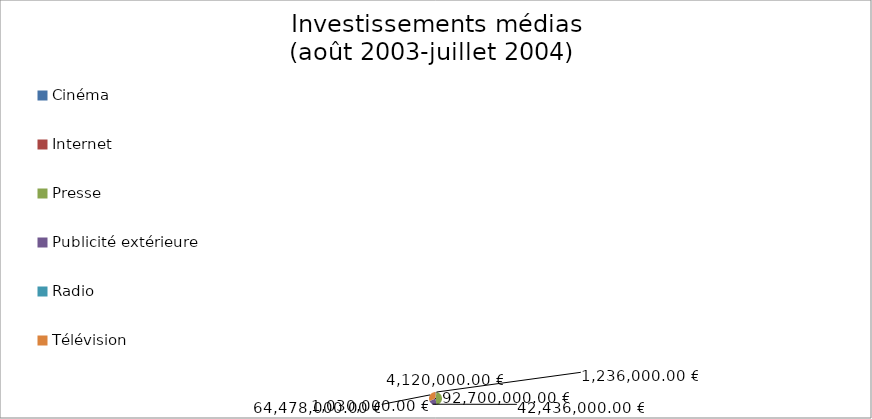
| Category | Series 0 |
|---|---|
| Cinéma | 4120000 |
| Internet | 1236000 |
| Presse | 92700000 |
| Publicité extérieure | 42436000 |
| Radio | 1030000 |
| Télévision | 64478000 |